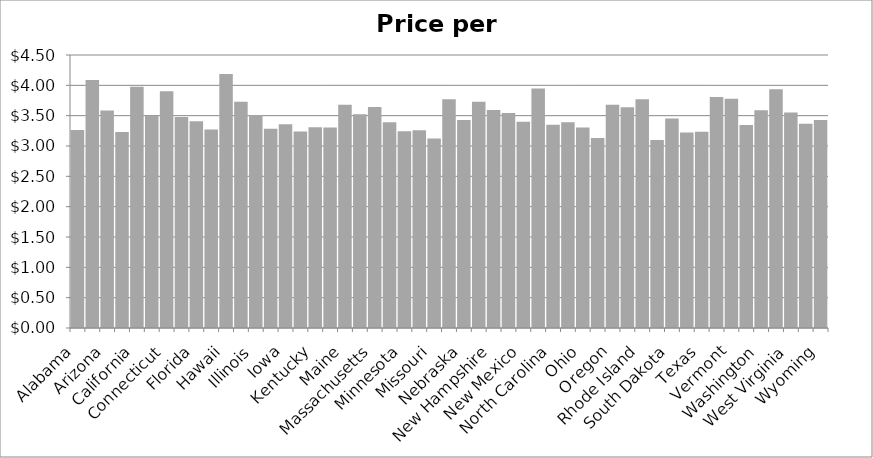
| Category | Price |
|---|---|
| Alabama | 3.262 |
| Alaska | 4.089 |
| Arizona | 3.585 |
| Arkansas | 3.229 |
| California | 3.978 |
| Colorado | 3.499 |
| Connecticut | 3.901 |
| Delaware | 3.479 |
| Florida | 3.409 |
| Georgia | 3.274 |
| Hawaii | 4.187 |
| Idaho | 3.728 |
| Illinois | 3.511 |
| Indiana | 3.283 |
| Iowa | 3.357 |
| Kansas | 3.241 |
| Kentucky | 3.311 |
| Louisiana | 3.306 |
| Maine | 3.681 |
| Maryland | 3.522 |
| Massachusetts | 3.642 |
| Michigan | 3.392 |
| Minnesota | 3.245 |
| Mississippi | 3.259 |
| Missouri | 3.125 |
| Montana | 3.772 |
| Nebraska | 3.428 |
| Nevada | 3.728 |
| New Hampshire | 3.594 |
| New Jersey | 3.545 |
| New Mexico | 3.398 |
| New York | 3.946 |
| North Carolina | 3.35 |
| North Dakota | 3.391 |
| Ohio | 3.304 |
| Oklahoma | 3.132 |
| Oregon | 3.68 |
| Pennsylvania | 3.637 |
| Rhode Island | 3.769 |
| South Carolina | 3.098 |
| South Dakota | 3.454 |
| Tennessee | 3.224 |
| Texas | 3.233 |
| Utah | 3.809 |
| Vermont | 3.779 |
| Virginia | 3.346 |
| Washington | 3.588 |
| Washington DC | 3.935 |
| West Virginia | 3.554 |
| Wisconsin | 3.367 |
| Wyoming | 3.429 |